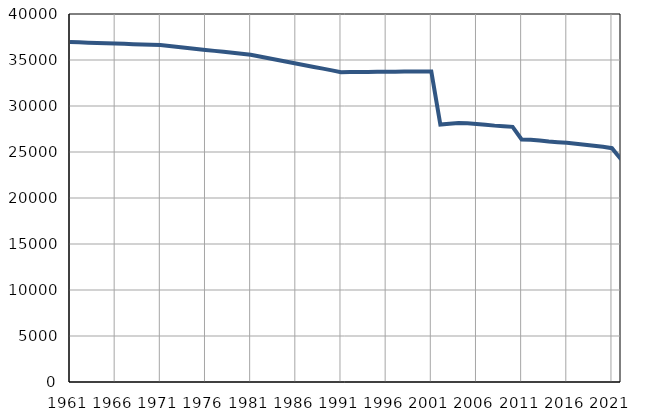
| Category | Population
size |
|---|---|
| 1961.0 | 36950 |
| 1962.0 | 36917 |
| 1963.0 | 36884 |
| 1964.0 | 36852 |
| 1965.0 | 36819 |
| 1966.0 | 36786 |
| 1967.0 | 36753 |
| 1968.0 | 36720 |
| 1969.0 | 36688 |
| 1970.0 | 36655 |
| 1971.0 | 36622 |
| 1972.0 | 36517 |
| 1973.0 | 36411 |
| 1974.0 | 36306 |
| 1975.0 | 36201 |
| 1976.0 | 36096 |
| 1977.0 | 35991 |
| 1978.0 | 35886 |
| 1979.0 | 35780 |
| 1980.0 | 35675 |
| 1981.0 | 35570 |
| 1982.0 | 35381 |
| 1983.0 | 35192 |
| 1984.0 | 35003 |
| 1985.0 | 34814 |
| 1986.0 | 34626 |
| 1987.0 | 34437 |
| 1988.0 | 34248 |
| 1989.0 | 34060 |
| 1990.0 | 33870 |
| 1991.0 | 33681 |
| 1992.0 | 33689 |
| 1993.0 | 33697 |
| 1994.0 | 33705 |
| 1995.0 | 33713 |
| 1996.0 | 33721 |
| 1997.0 | 33729 |
| 1998.0 | 33737 |
| 1999.0 | 33746 |
| 2000.0 | 33753 |
| 2001.0 | 33761 |
| 2002.0 | 27988 |
| 2003.0 | 28083 |
| 2004.0 | 28155 |
| 2005.0 | 28120 |
| 2006.0 | 28048 |
| 2007.0 | 27959 |
| 2008.0 | 27867 |
| 2009.0 | 27809 |
| 2010.0 | 27735 |
| 2011.0 | 26366 |
| 2012.0 | 26329 |
| 2013.0 | 26259 |
| 2014.0 | 26141 |
| 2015.0 | 26067 |
| 2016.0 | 25993 |
| 2017.0 | 25907 |
| 2018.0 | 25798 |
| 2019.0 | 25690 |
| 2020.0 | 25560 |
| 2021.0 | 25411 |
| 2022.0 | 24204 |